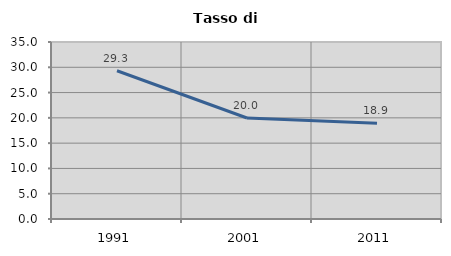
| Category | Tasso di disoccupazione   |
|---|---|
| 1991.0 | 29.313 |
| 2001.0 | 19.978 |
| 2011.0 | 18.914 |